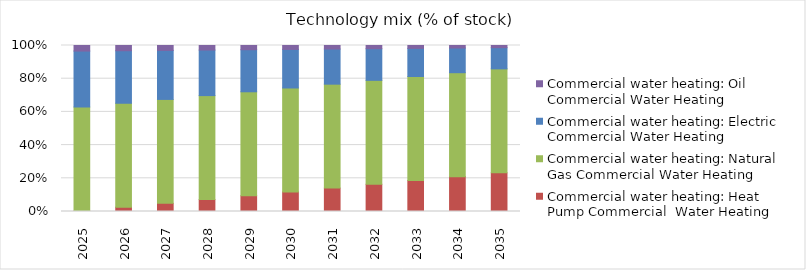
| Category | Commercial water heating: Heat Pump Commercial  Water Heating | Commercial water heating: Natural Gas Commercial Water Heating | Commercial water heating: Electric Commercial Water Heating | Commercial water heating: Oil Commercial Water Heating |
|---|---|---|---|---|
| 2025.0 | 0.003 | 0.626 | 0.337 | 0.034 |
| 2026.0 | 0.026 | 0.626 | 0.316 | 0.032 |
| 2027.0 | 0.049 | 0.626 | 0.295 | 0.03 |
| 2028.0 | 0.072 | 0.626 | 0.274 | 0.027 |
| 2029.0 | 0.095 | 0.626 | 0.253 | 0.025 |
| 2030.0 | 0.118 | 0.626 | 0.232 | 0.023 |
| 2031.0 | 0.141 | 0.626 | 0.212 | 0.021 |
| 2032.0 | 0.164 | 0.626 | 0.191 | 0.019 |
| 2033.0 | 0.187 | 0.626 | 0.17 | 0.017 |
| 2034.0 | 0.21 | 0.626 | 0.149 | 0.015 |
| 2035.0 | 0.233 | 0.626 | 0.128 | 0.013 |